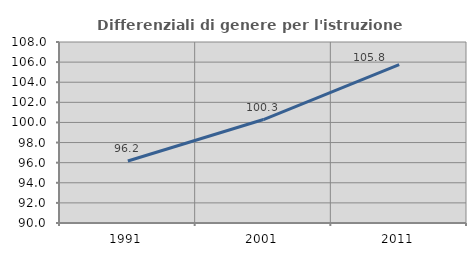
| Category | Differenziali di genere per l'istruzione superiore |
|---|---|
| 1991.0 | 96.167 |
| 2001.0 | 100.291 |
| 2011.0 | 105.755 |